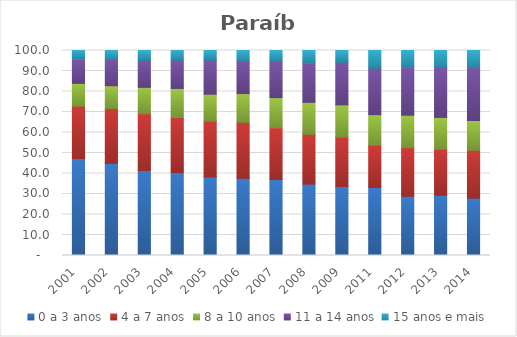
| Category | 0 a 3 anos | 4 a 7 anos | 8 a 10 anos | 11 a 14 anos | 15 anos e mais |
|---|---|---|---|---|---|
| 2001.0 | 47.29 | 25.55 | 11.12 | 11.95 | 4.09 |
| 2002.0 | 44.98 | 26.72 | 11.1 | 12.82 | 4.39 |
| 2003.0 | 41.41 | 27.8 | 12.82 | 13.19 | 4.79 |
| 2004.0 | 40.49 | 27.08 | 13.93 | 13.77 | 4.73 |
| 2005.0 | 38.28 | 27.42 | 12.98 | 16.59 | 4.73 |
| 2006.0 | 37.65 | 27.32 | 14 | 15.71 | 5.32 |
| 2007.0 | 37.05 | 25.3 | 14.65 | 17.67 | 5.33 |
| 2008.0 | 34.82 | 24.33 | 15.57 | 19.32 | 5.97 |
| 2009.0 | 33.63 | 24.28 | 15.51 | 20.79 | 5.79 |
| 2011.0 | 33.19 | 20.56 | 14.91 | 22.73 | 8.6 |
| 2012.0 | 28.89 | 23.74 | 15.8 | 23.64 | 7.92 |
| 2013.0 | 29.37 | 22.44 | 15.54 | 24.35 | 8.3 |
| 2014.0 | 27.96 | 23.37 | 14.52 | 25.81 | 8.34 |